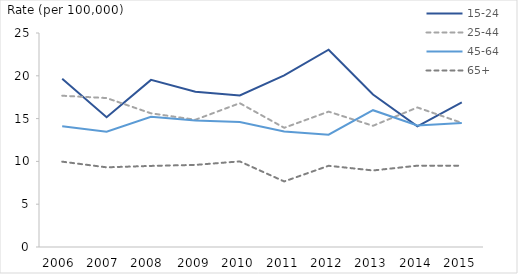
| Category | 15-24 | 25-44 | 45-64 | 65+ |
|---|---|---|---|---|
| 2006  | 19.659 | 17.673 | 14.116 | 9.969 |
| 2007  | 15.157 | 17.401 | 13.472 | 9.309 |
| 2008  | 19.522 | 15.617 | 15.213 | 9.474 |
| 2009 | 18.143 | 14.867 | 14.783 | 9.592 |
| 2010 | 17.702 | 16.8 | 14.6 | 10 |
| 2011 | 20.056 | 13.926 | 13.493 | 7.657 |
| 2012 | 23.047 | 15.815 | 13.124 | 9.488 |
| 2013 | 17.819 | 14.161 | 15.982 | 8.942 |
| 2014 | 14.1 | 16.3 | 14.2 | 9.5 |
| 2015 | 16.9 | 14.5 | 14.5 | 9.5 |